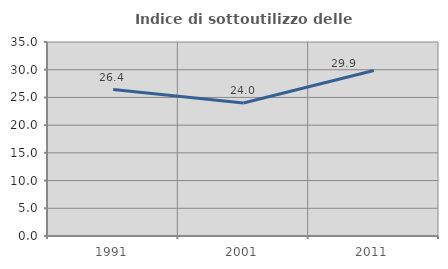
| Category | Indice di sottoutilizzo delle abitazioni  |
|---|---|
| 1991.0 | 26.413 |
| 2001.0 | 24.004 |
| 2011.0 | 29.851 |